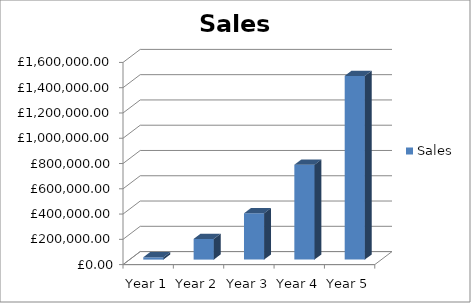
| Category | Sales |
|---|---|
| Year 1 | 18400 |
| Year 2 | 163625 |
| Year 3 | 366336 |
| Year 4 | 750484 |
| Year 5 | 1453870 |